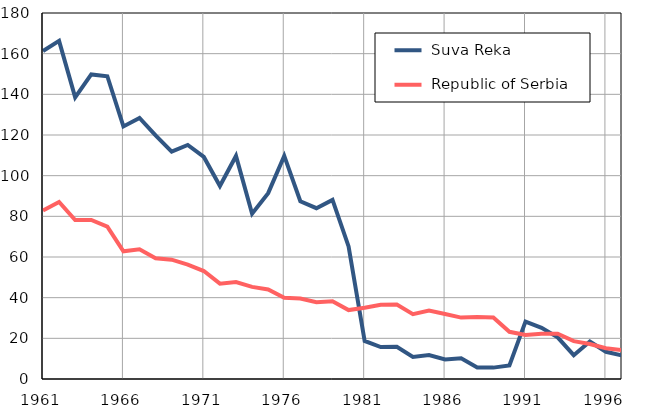
| Category |  Suva Reka |  Republic of Serbia |
|---|---|---|
| 1961.0 | 161.3 | 82.9 |
| 1962.0 | 166.3 | 87.1 |
| 1963.0 | 138.5 | 78.2 |
| 1964.0 | 149.8 | 78.2 |
| 1965.0 | 148.9 | 74.9 |
| 1966.0 | 124.2 | 62.8 |
| 1967.0 | 128.4 | 63.8 |
| 1968.0 | 119.8 | 59.4 |
| 1969.0 | 111.8 | 58.7 |
| 1970.0 | 115.1 | 56.3 |
| 1971.0 | 109.2 | 53.1 |
| 1972.0 | 94.9 | 46.9 |
| 1973.0 | 109.7 | 47.7 |
| 1974.0 | 81.3 | 45.3 |
| 1975.0 | 91.4 | 44 |
| 1976.0 | 109.7 | 39.9 |
| 1977.0 | 87.4 | 39.6 |
| 1978.0 | 84 | 37.8 |
| 1979.0 | 88.1 | 38.2 |
| 1980.0 | 65.2 | 33.9 |
| 1981.0 | 18.7 | 35 |
| 1982.0 | 15.7 | 36.5 |
| 1983.0 | 15.8 | 36.6 |
| 1984.0 | 10.8 | 31.9 |
| 1985.0 | 11.8 | 33.7 |
| 1986.0 | 9.6 | 32 |
| 1987.0 | 10.2 | 30.2 |
| 1988.0 | 5.7 | 30.5 |
| 1989.0 | 5.6 | 30.2 |
| 1990.0 | 6.7 | 23.2 |
| 1991.0 | 28.2 | 21.6 |
| 1992.0 | 25.2 | 22.3 |
| 1993.0 | 20.5 | 22.3 |
| 1994.0 | 11.7 | 18.6 |
| 1995.0 | 18.4 | 17.2 |
| 1996.0 | 13.4 | 15.1 |
| 1997.0 | 11.6 | 14.2 |